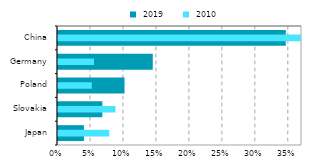
| Category |  2019 |
|---|---|
| Japan | 0.039 |
| Slovakia | 0.067 |
| Poland | 0.101 |
| Germany | 0.144 |
| China | 0.345 |